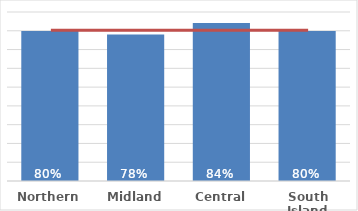
| Category | Total |
|---|---|
| Northern | 0.798 |
| Midland | 0.78 |
| Central | 0.841 |
| South Island | 0.798 |